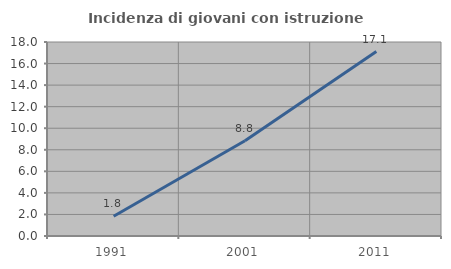
| Category | Incidenza di giovani con istruzione universitaria |
|---|---|
| 1991.0 | 1.835 |
| 2001.0 | 8.834 |
| 2011.0 | 17.11 |